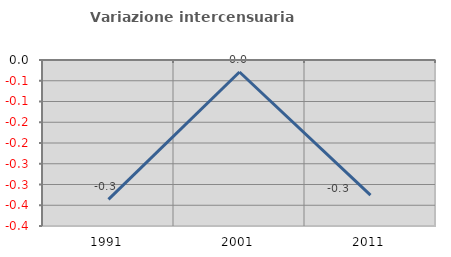
| Category | Variazione intercensuaria annua |
|---|---|
| 1991.0 | -0.336 |
| 2001.0 | -0.029 |
| 2011.0 | -0.326 |